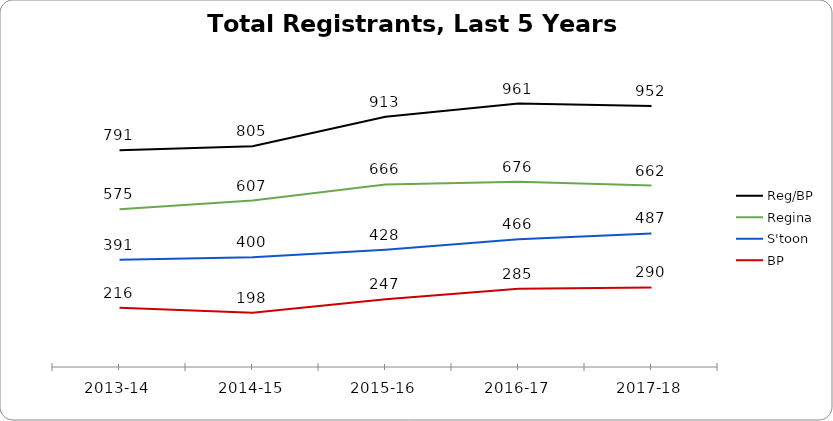
| Category | Reg/BP | Regina | S'toon | BP |
|---|---|---|---|---|
| 2013-14 | 791 | 575 | 391 | 216 |
| 2014-15 | 805 | 607 | 400 | 198 |
| 2015-16 | 913 | 666 | 428 | 247 |
| 2016-17 | 961 | 676 | 466 | 285 |
| 2017-18 | 952 | 662 | 487 | 290 |